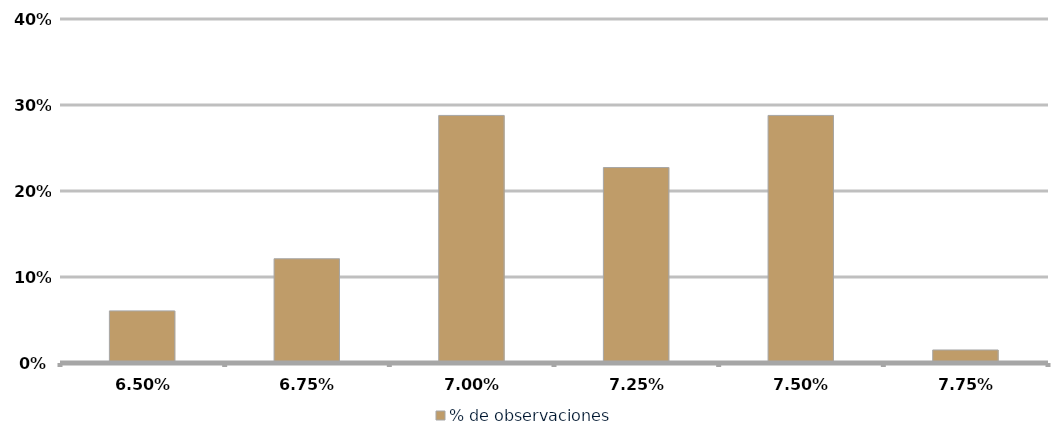
| Category | % de observaciones  |
|---|---|
| 0.06499999999999999 | 0.061 |
| 0.06749999999999999 | 0.121 |
| 0.06999999999999999 | 0.288 |
| 0.0725 | 0.227 |
| 0.075 | 0.288 |
| 0.0775 | 0.015 |